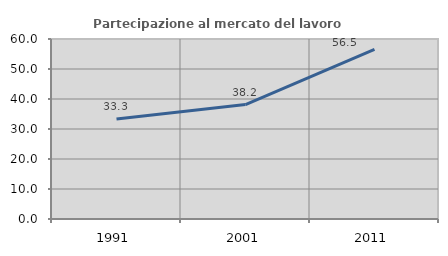
| Category | Partecipazione al mercato del lavoro  femminile |
|---|---|
| 1991.0 | 33.333 |
| 2001.0 | 38.153 |
| 2011.0 | 56.502 |